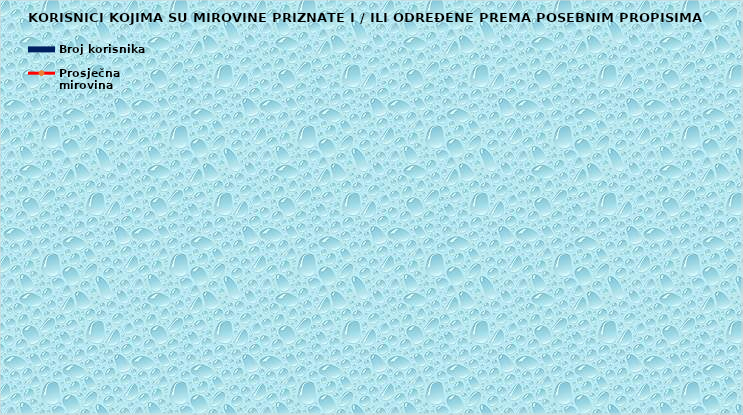
| Category | Broj korisnika |
|---|---|
|      a) radnici na poslovima ovlaštenih službenih osoba u tijelima unutarnjih 
poslova i pravosuđa, kojima je pravo na mirovinu priznato prema propisima
koji su bili na snazi do stupanja na snagu Zakona o pravima iz mirovinskog
osiguranja DVO, PS i OSO | 7399 |
|      b) radnici na  poslovima policijskih službenika, ovlaštenih službenih osoba pravosuđa i službene osobe s posebnim dužnostima i ovlastima u sigurnosno obavještajnom sustavu RH koji su pravo na mirovinu ostvarili prema Zakonu o pravima DVO, PS i OSO | 9230 |
|      c) radnici na poslovima razminiranja | 653 |
| Korisnici koji pravo na mirovinu ostvaruju prema Zakonu o vatrogastvu (NN 125/19)* | 311 |
| Djelatne vojne osobe - DVO  | 16100 |
| Pripadnici Hrvatske domovinske vojske od 1941. do 1945. godine | 2220 |
| Bivši politički zatvorenici | 2217 |
| Hrvatski branitelji iz Domovinskog rata - ZOHBDR | 71253 |
| Mirovine priznate prema općim propisima, a određene prema
ZOHBDR - u iz 2017. (čl. 27., 35., 48. i 49. stavak 2.)  | 55886 |
| Pripadnici bivše Jugoslavenske narodne armije - JNA | 3992 |
| Pripadnici bivše Jugoslavenske narodne armije - JNA - čl. 185 ZOMO | 159 |
| Sudionici Narodnooslobodilačkog rata - NOR | 5634 |
| Zastupnici u Hrvatskom saboru, članovi Vlade, suci Ustavnog suda i glavni državni revizor  | 686 |
| Članovi Izvršnog vijeća Sabora, Saveznog izvršnog vijeća i administrativno umirovljeni javni službenici | 69 |
| Bivši službenici u saveznim tijelima bivše SFRJ - članak 38. ZOMO | 21 |
| Redoviti članovi Hrvatske akademije znanosti i umjetnosti - HAZU | 127 |
| Radnici u Istarskim ugljenokopima "Tupljak" d.d. Labin  | 249 |
| Radnici profesionalno izloženi azbestu | 836 |
| Osiguranici - članovi posade broda u međunarodnoj plovidbi i nacionalnoj plovidbi - članak 129. a stavak 2. Pomorskog zakonika | 206 |
| Pripadnici Hrvatskog vijeća obrane  - HVO  | 6759 |